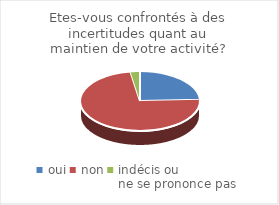
| Category | Etes-vous confrontés à des incertitudes quant au maintien de votre activité? |
|---|---|
| oui | 19 |
| non | 57 |
| indécis ou 
ne se prononce pas | 2 |